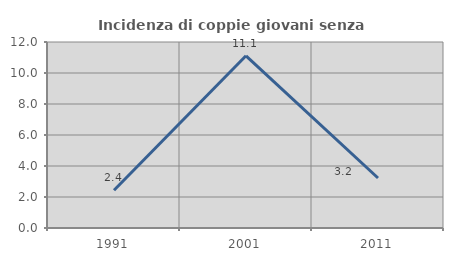
| Category | Incidenza di coppie giovani senza figli |
|---|---|
| 1991.0 | 2.439 |
| 2001.0 | 11.111 |
| 2011.0 | 3.226 |